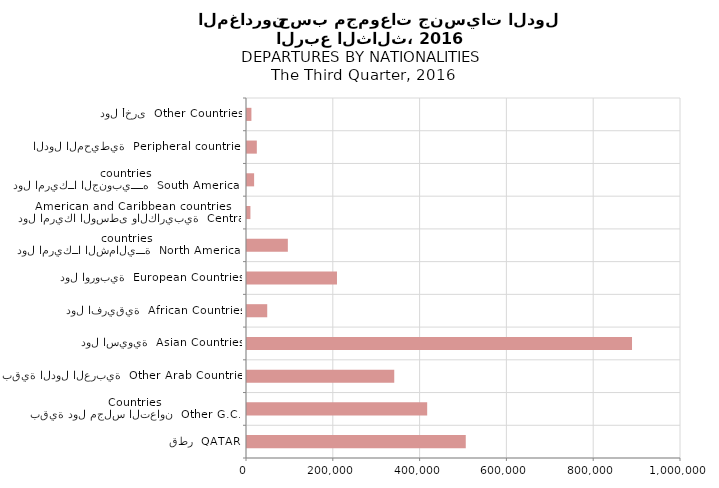
| Category | Series 0 |
|---|---|
| قطر  QATAR | 504060 |
| بقية دول مجلس التعاون  Other G.C.C Countries | 415165 |
| بقية الدول العربية  Other Arab Countries | 339262 |
| دول اسيوية  Asian Countries | 887139 |
| دول افريقية  African Countries | 46603 |
| دول اوروبية  European Countries | 207344 |
| دول امريكــا الشماليـــة  North American countries  | 94117 |
| دول امريكا الوسطى والكاريبية  Central American and Caribbean countries | 7886 |
| دول امريكــا الجنوبيــــه  South American countries | 16385 |
| الدول المحيطية  Peripheral countries | 22635 |
| دول أخرى  Other Countries | 10153 |